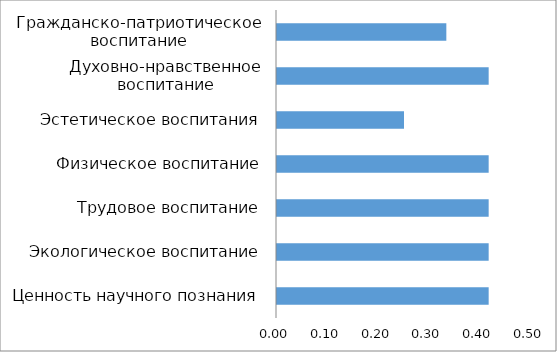
| Category | Series 0 |
|---|---|
| Гражданско-патриотическое воспитание | 0.333 |
| Духовно-нравственное воспитание | 0.417 |
| Эстетическое воспитания | 0.25 |
| Физическое воспитание | 0.417 |
| Трудовое воспитание | 0.417 |
| Экологическое воспитание | 0.417 |
| Ценность научного познания | 0.417 |